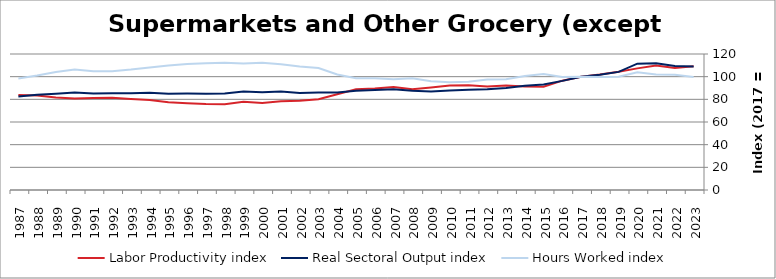
| Category | Labor Productivity index | Real Sectoral Output index | Hours Worked index |
|---|---|---|---|
| 2023.0 | 109.259 | 109.025 | 99.786 |
| 2022.0 | 107.616 | 109.412 | 101.669 |
| 2021.0 | 109.843 | 111.889 | 101.863 |
| 2020.0 | 107.321 | 111.478 | 103.873 |
| 2019.0 | 104.337 | 104.209 | 99.878 |
| 2018.0 | 101.955 | 101.658 | 99.709 |
| 2017.0 | 100 | 100 | 100 |
| 2016.0 | 96.467 | 96.278 | 99.804 |
| 2015.0 | 91.049 | 93.17 | 102.33 |
| 2014.0 | 91.332 | 91.932 | 100.657 |
| 2013.0 | 92.113 | 90.086 | 97.799 |
| 2012.0 | 91.321 | 88.976 | 97.432 |
| 2011.0 | 92.438 | 88.374 | 95.604 |
| 2010.0 | 92.205 | 87.712 | 95.127 |
| 2009.0 | 90.526 | 86.842 | 95.931 |
| 2008.0 | 88.91 | 87.593 | 98.518 |
| 2007.0 | 90.929 | 88.841 | 97.703 |
| 2006.0 | 89.511 | 88.335 | 98.686 |
| 2005.0 | 88.792 | 87.556 | 98.608 |
| 2004.0 | 84.431 | 86.057 | 101.925 |
| 2003.0 | 80.019 | 86.091 | 107.588 |
| 2002.0 | 78.663 | 85.688 | 108.93 |
| 2001.0 | 78.32 | 86.97 | 111.045 |
| 2000.0 | 76.691 | 86.169 | 112.36 |
| 1999.0 | 77.811 | 86.806 | 111.561 |
| 1998.0 | 75.753 | 85.048 | 112.27 |
| 1997.0 | 75.942 | 84.919 | 111.822 |
| 1996.0 | 76.581 | 85.126 | 111.158 |
| 1995.0 | 77.389 | 85.002 | 109.838 |
| 1994.0 | 79.361 | 85.758 | 108.06 |
| 1993.0 | 80.321 | 85.357 | 106.27 |
| 1992.0 | 81.439 | 85.419 | 104.887 |
| 1991.0 | 81.145 | 85.087 | 104.859 |
| 1990.0 | 80.802 | 85.945 | 106.365 |
| 1989.0 | 81.576 | 84.862 | 104.028 |
| 1988.0 | 83.327 | 84.125 | 100.958 |
| 1987.0 | 83.877 | 82.528 | 98.392 |